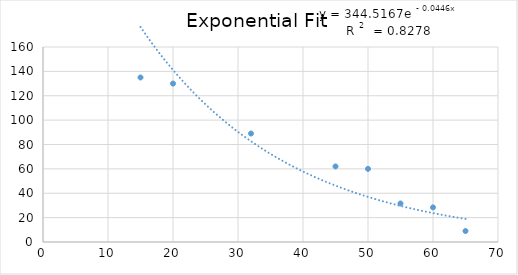
| Category | Price |
|---|---|
| 15.0 | 135 |
| 20.0 | 130 |
| 32.0 | 89 |
| 45.0 | 62 |
| 50.0 | 60 |
| 55.0 | 31.6 |
| 60.0 | 28.4 |
| 65.0 | 9 |